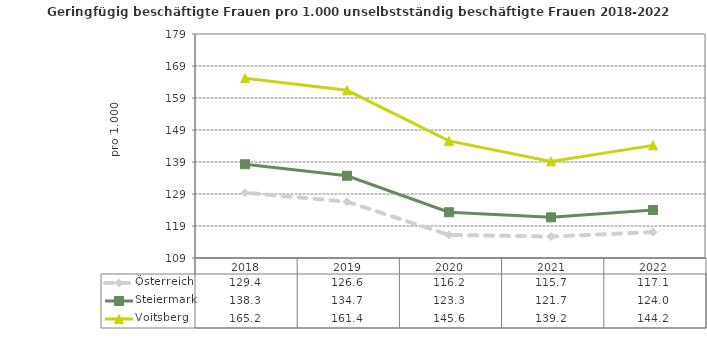
| Category | Österreich | Steiermark | Voitsberg |
|---|---|---|---|
| 2022.0 | 117.1 | 124 | 144.2 |
| 2021.0 | 115.7 | 121.7 | 139.2 |
| 2020.0 | 116.2 | 123.3 | 145.6 |
| 2019.0 | 126.6 | 134.7 | 161.4 |
| 2018.0 | 129.4 | 138.3 | 165.2 |